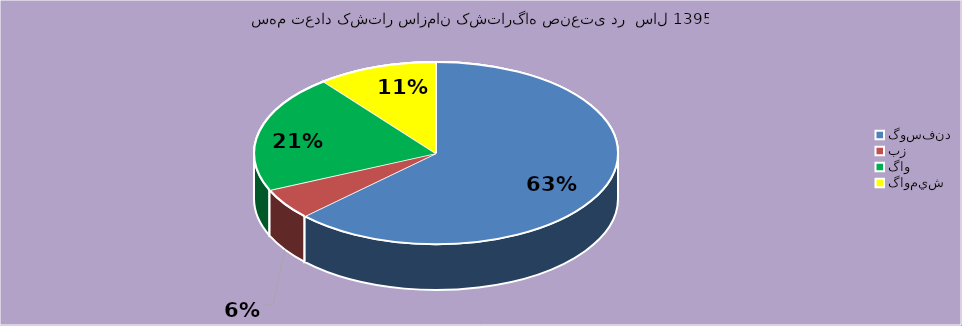
| Category | Series 0 |
|---|---|
| گوسفند | 27169 |
| بز | 2396 |
| گاو | 9098 |
| گاوميش | 4576 |